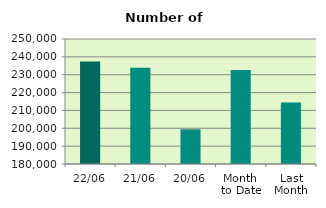
| Category | Series 0 |
|---|---|
| 22/06 | 237344 |
| 21/06 | 233958 |
| 20/06 | 199436 |
| Month 
to Date | 232615.5 |
| Last
Month | 214383.182 |